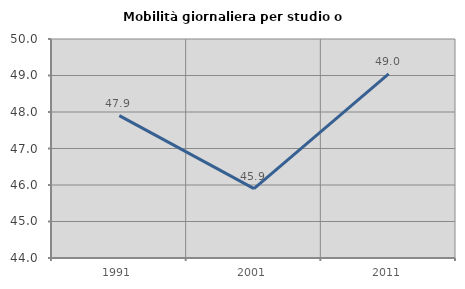
| Category | Mobilità giornaliera per studio o lavoro |
|---|---|
| 1991.0 | 47.901 |
| 2001.0 | 45.899 |
| 2011.0 | 49.047 |